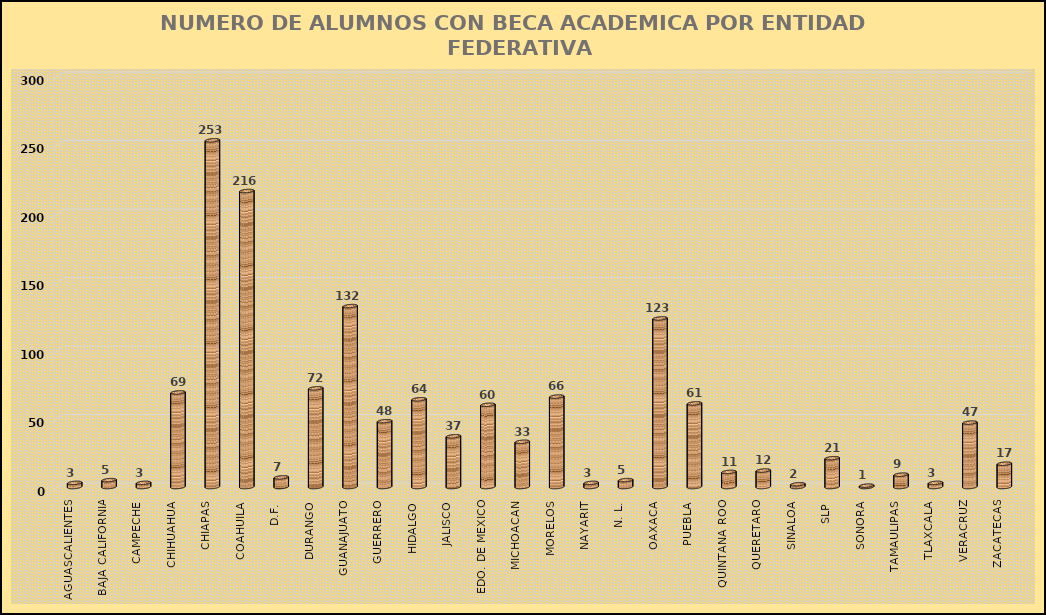
| Category | No. BECADOS |
|---|---|
| AGUASCALIENTES | 3 |
| BAJA CALIFORNIA | 5 |
| CAMPECHE | 3 |
| CHIHUAHUA | 69 |
| CHIAPAS | 253 |
| COAHUILA | 216 |
| D.F. | 7 |
| DURANGO | 72 |
| GUANAJUATO | 132 |
| GUERRERO | 48 |
| HIDALGO | 64 |
| JALISCO | 37 |
| EDO. DE MEXICO | 60 |
| MICHOACAN | 33 |
| MORELOS | 66 |
| NAYARIT | 3 |
| N. L. | 5 |
| OAXACA | 123 |
| PUEBLA | 61 |
| QUINTANA ROO | 11 |
| QUERETARO | 12 |
| SINALOA | 2 |
| SLP | 21 |
| SONORA | 1 |
| TAMAULIPAS | 9 |
| TLAXCALA | 3 |
| VERACRUZ | 47 |
| ZACATECAS | 17 |